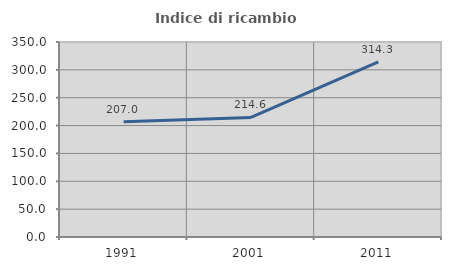
| Category | Indice di ricambio occupazionale  |
|---|---|
| 1991.0 | 206.977 |
| 2001.0 | 214.563 |
| 2011.0 | 314.286 |